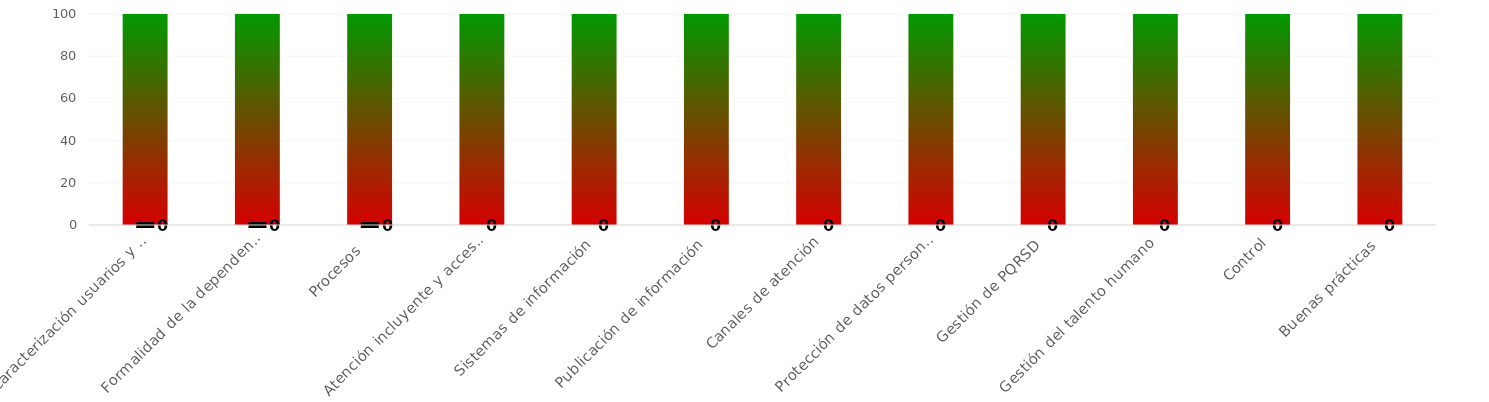
| Category | Niveles |
|---|---|
| Caracterización usuarios y medición de percepción  | 100 |
| Formalidad de la dependencia o área | 100 |
| Procesos  | 100 |
| Atención incluyente y accesibilidad  | 100 |
| Sistemas de información | 100 |
| Publicación de información | 100 |
| Canales de atención | 100 |
| Protección de datos personales  | 100 |
| Gestión de PQRSD  | 100 |
| Gestión del talento humano  | 100 |
| Control | 100 |
| Buenas prácticas | 100 |